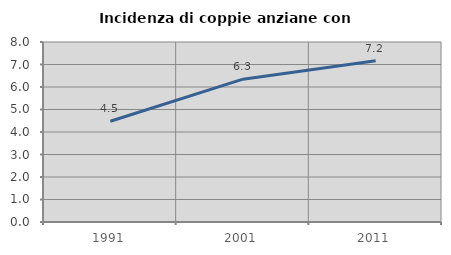
| Category | Incidenza di coppie anziane con figli |
|---|---|
| 1991.0 | 4.478 |
| 2001.0 | 6.348 |
| 2011.0 | 7.165 |